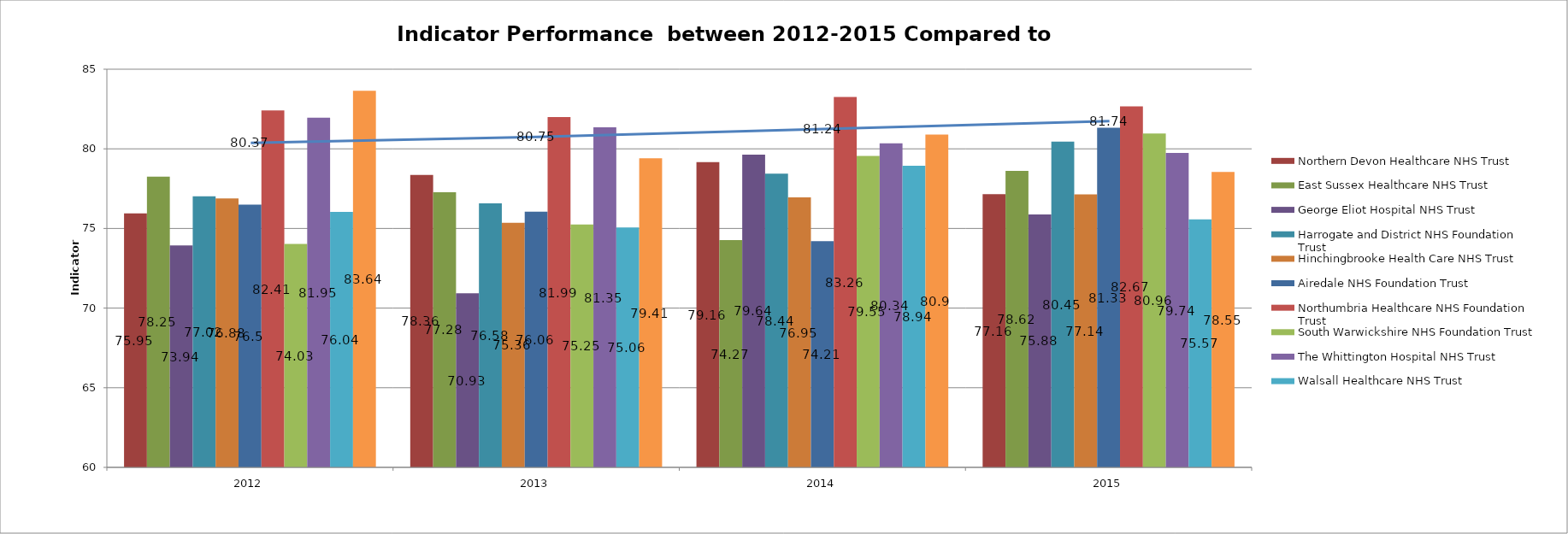
| Category | Northern Devon Healthcare NHS Trust | East Sussex Healthcare NHS Trust | George Eliot Hospital NHS Trust | Harrogate and District NHS Foundation Trust | Hinchingbrooke Health Care NHS Trust | Airedale NHS Foundation Trust | Northumbria Healthcare NHS Foundation Trust | South Warwickshire NHS Foundation Trust | The Whittington Hospital NHS Trust | Walsall Healthcare NHS Trust | Wye Valley NHS Trust |
|---|---|---|---|---|---|---|---|---|---|---|---|
| 2012 | 75.95 | 78.25 | 73.94 | 77.02 | 76.88 | 76.5 | 82.41 | 74.03 | 81.95 | 76.04 | 83.64 |
| 2013 | 78.36 | 77.28 | 70.93 | 76.58 | 75.36 | 76.06 | 81.99 | 75.25 | 81.35 | 75.06 | 79.41 |
| 2014 | 79.16 | 74.27 | 79.64 | 78.44 | 76.95 | 74.21 | 83.26 | 79.55 | 80.34 | 78.94 | 80.9 |
| 2015 | 77.16 | 78.62 | 75.88 | 80.45 | 77.14 | 81.33 | 82.67 | 80.96 | 79.74 | 75.57 | 78.55 |